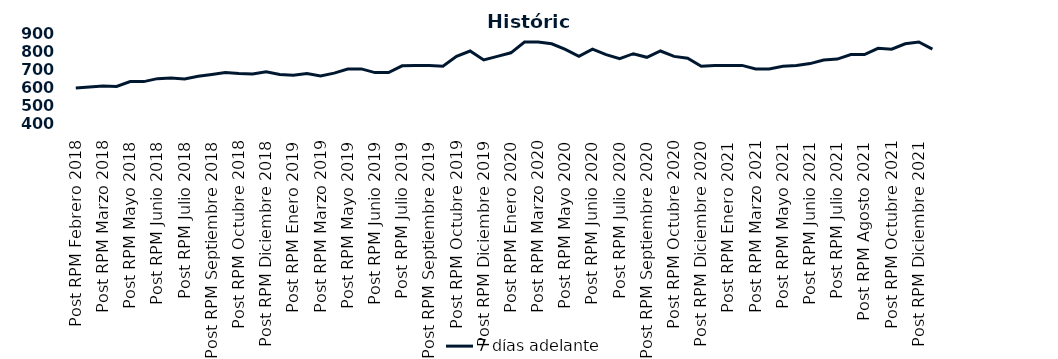
| Category | 7 días adelante  |
|---|---|
| Post RPM Febrero 2018 | 595 |
| Pre RPM Marzo 2018 | 600 |
| Post RPM Marzo 2018 | 605 |
| Pre RPM Mayo 2018 | 603 |
| Post RPM Mayo 2018 | 630 |
| Pre RPM Junio 2018 | 630 |
| Post RPM Junio 2018 | 646.5 |
| Pre RPM Julio 2018 | 650 |
| Post RPM Julio 2018 | 645 |
| Pre RPM Septiembre 2018 | 660 |
| Post RPM Septiembre 2018 | 670 |
| Pre RPM Octubre 2018 | 680 |
| Post RPM Octubre 2018 | 675 |
| Pre RPM Diciembre 2018 | 672.5 |
| Post RPM Diciembre 2018 | 685 |
| Pre RPM Enero 2019 | 670 |
| Post RPM Enero 2019 | 665 |
| Pre RPM Marzo 2019 | 675 |
| Post RPM Marzo 2019 | 661 |
| Pre RPM Mayo 2019 | 677 |
| Post RPM Mayo 2019 | 700 |
| Pre RPM Junio 2019 | 700.5 |
| Post RPM Junio 2019 | 680 |
| Pre RPM Julio 2019 | 680 |
| Post RPM Julio 2019 | 717.5 |
| Pre RPM Septiembre 2019 | 720 |
| Post RPM Septiembre 2019 | 720 |
| Pre RPM Octubre 2019 | 715 |
| Post RPM Octubre 2019 | 770 |
| Pre RPM Diciembre 2019 | 800 |
| Post RPM Diciembre 2019 | 750 |
| Pre RPM Enero 2020 | 770 |
| Post RPM Enero 2020 | 790 |
| Pre RPM Marzo 2020 | 850 |
| Post RPM Marzo 2020 | 850 |
| Pre RPM Mayo 2020 | 840 |
| Post RPM Mayo 2020 | 808.5 |
| Pre RPM Junio 2020 | 770 |
| Post RPM Junio 2020 | 810 |
| Pre RPM Julio 2020 | 780 |
| Post RPM Julio 2020 | 757 |
| Pre RPM Septiembre 2020 | 785 |
| Post RPM Septiembre 2020 | 765 |
| Pre RPM Octubre 2020 | 800 |
| Post RPM Octubre 2020 | 770 |
| Pre RPM Diciembre 2020 | 760 |
| Post RPM Diciembre 2020 | 715 |
| Pre RPM Enero 2021 | 720 |
| Post RPM Enero 2021 | 720 |
| Pre RPM Marzo 2021 | 720 |
| Post RPM Marzo 2021 | 700 |
| Pre RPM Mayo 2021 | 700 |
| Post RPM Mayo 2021 | 715 |
| Pre RPM Junio 2021 | 720 |
| Post RPM Junio 2021 | 730 |
| Pre RPM Julio 2021 | 750 |
| Post RPM Julio 2021 | 755 |
| Pre RPM Agosto 2021 | 780 |
| Post RPM Agosto 2021 | 780 |
| Pre RPM Octubre 2021 | 815 |
| Post RPM Octubre 2021 | 810 |
| Pre RPM Diciembre 2021 | 840 |
| Post RPM Diciembre 2021 | 850 |
| Pre RPM Enero 2022 | 810 |